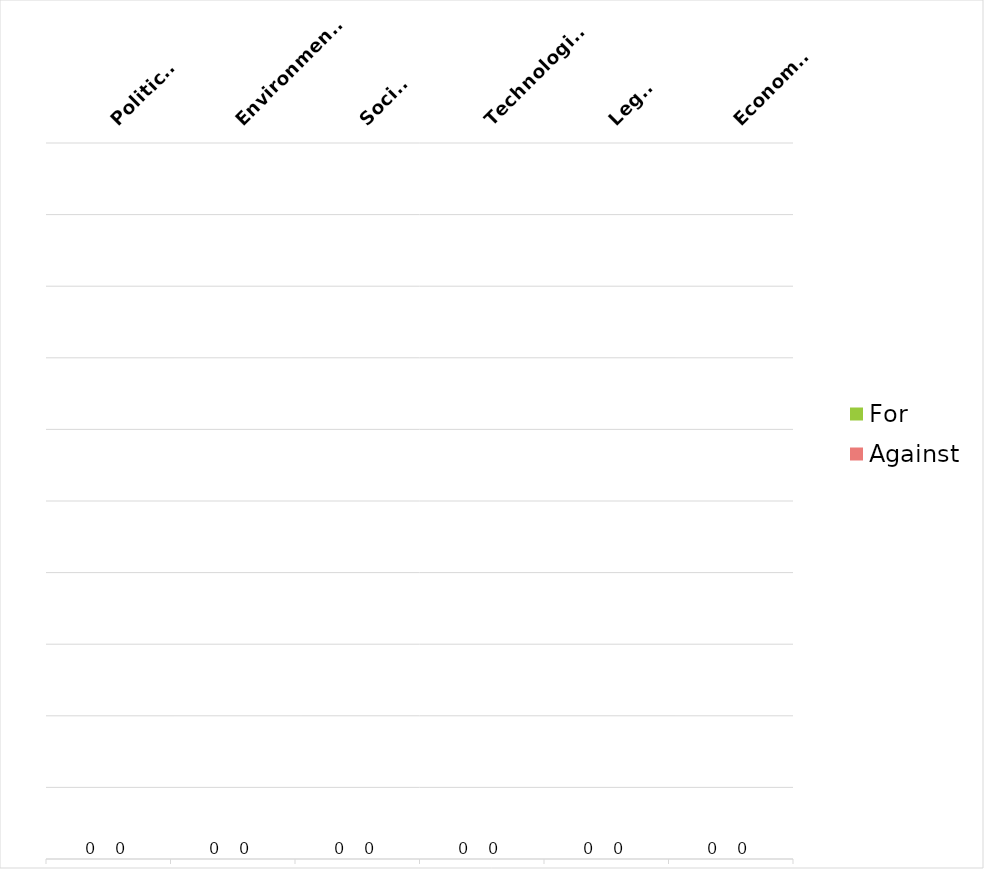
| Category | For | Against |
|---|---|---|
| Political | 0 | 0 |
| Environmental | 0 | 0 |
| Social | 0 | 0 |
| Technological | 0 | 0 |
| Legal | 0 | 0 |
| Economic | 0 | 0 |